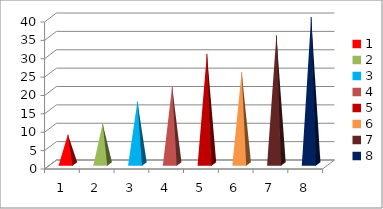
| Category | Series 0 |
|---|---|
| 0 | 8 |
| 1 | 11 |
| 2 | 17 |
| 3 | 21 |
| 4 | 30 |
| 5 | 25 |
| 6 | 35 |
| 7 | 40 |